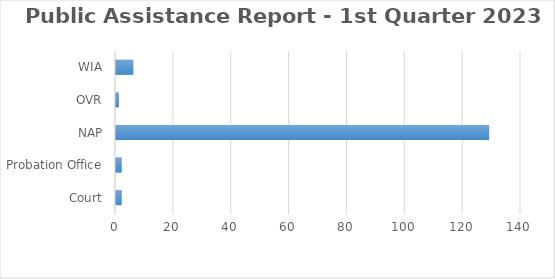
| Category | Series 0 |
|---|---|
| Court | 2 |
| Probation Office | 2 |
| NAP | 129 |
| OVR | 1 |
| WIA | 6 |